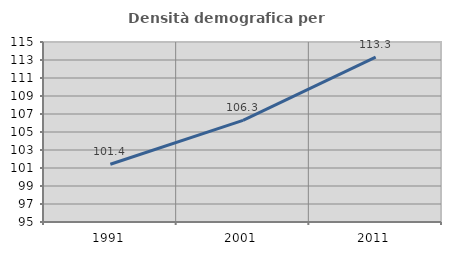
| Category | Densità demografica |
|---|---|
| 1991.0 | 101.418 |
| 2001.0 | 106.292 |
| 2011.0 | 113.326 |